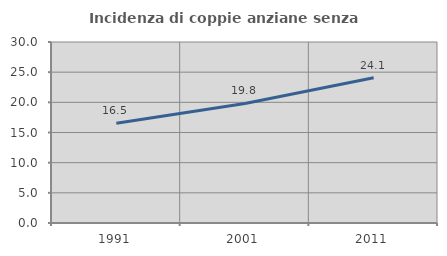
| Category | Incidenza di coppie anziane senza figli  |
|---|---|
| 1991.0 | 16.525 |
| 2001.0 | 19.815 |
| 2011.0 | 24.086 |